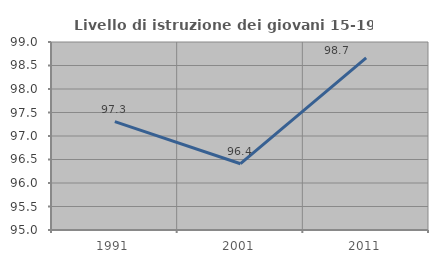
| Category | Livello di istruzione dei giovani 15-19 anni |
|---|---|
| 1991.0 | 97.306 |
| 2001.0 | 96.41 |
| 2011.0 | 98.661 |